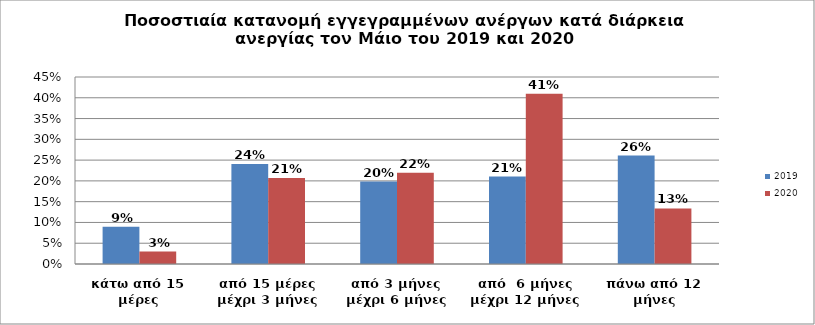
| Category | 2019 | 2020 |
|---|---|---|
| κάτω από 15 μέρες | 0.09 | 0.03 |
| από 15 μέρες μέχρι 3 μήνες | 0.241 | 0.207 |
| από 3 μήνες μέχρι 6 μήνες | 0.198 | 0.22 |
| από  6 μήνες μέχρι 12 μήνες | 0.21 | 0.41 |
| πάνω από 12 μήνες | 0.261 | 0.134 |